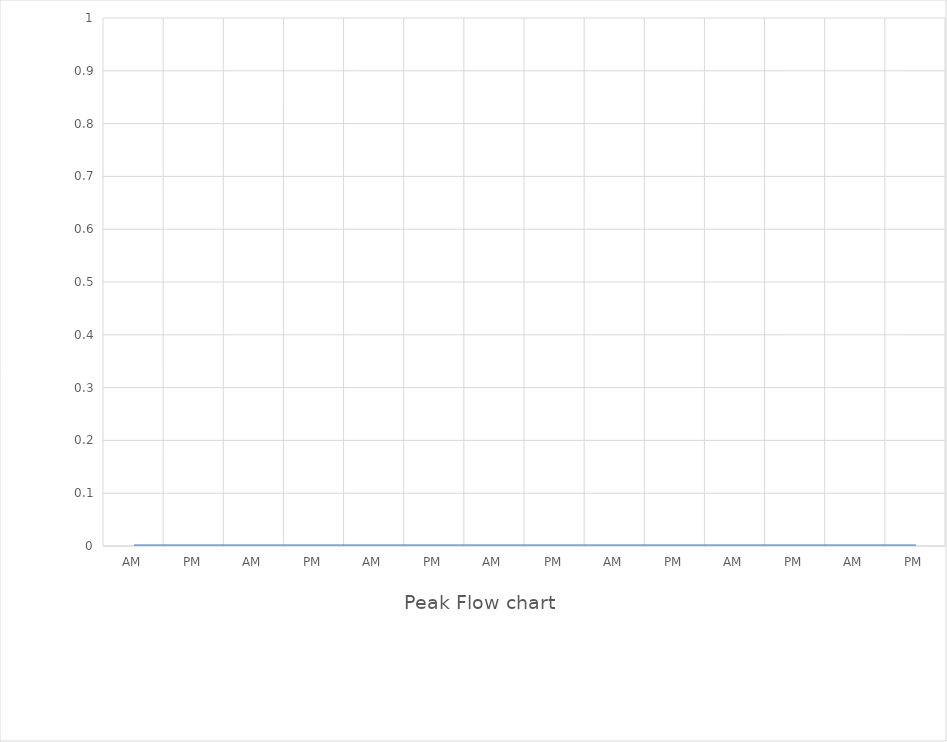
| Category | Series 0 |
|---|---|
| AM | 0 |
| PM | 0 |
| AM | 0 |
| PM | 0 |
| AM | 0 |
| PM | 0 |
| AM | 0 |
| PM | 0 |
| AM | 0 |
| PM | 0 |
| AM | 0 |
| PM | 0 |
| AM | 0 |
| PM | 0 |